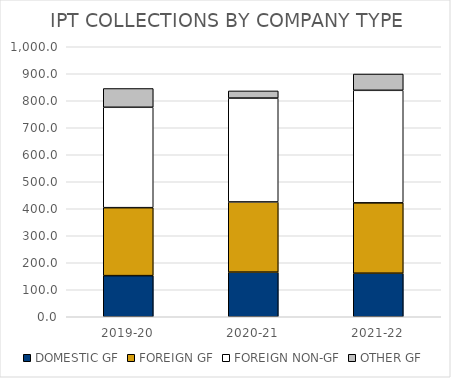
| Category | DOMESTIC | FOREIGN | OTHER |
|---|---|---|---|
| 2019-20 | 152.27 | 371.827 | 69.54 |
| 2020-21 | 165.245 | 384.67 | 26.517 |
| 2021-22 | 161.268 | 416.756 | 60.352 |